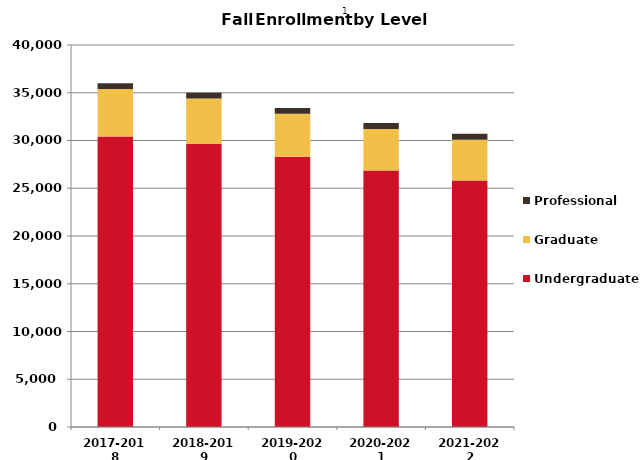
| Category | Undergraduate | Graduate | Professional |
|---|---|---|---|
| 2017-2018 | 30406 | 4991 | 596 |
| 2018-2019 | 29621 | 4774 | 597 |
| 2019-2020 | 28294 | 4498 | 599 |
| 2020-2021 | 26846 | 4352 | 627 |
| 2021-2022 | 25808 | 4264 | 636 |